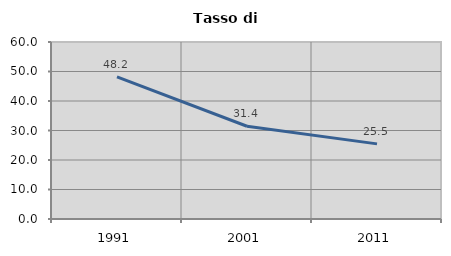
| Category | Tasso di disoccupazione   |
|---|---|
| 1991.0 | 48.183 |
| 2001.0 | 31.433 |
| 2011.0 | 25.466 |